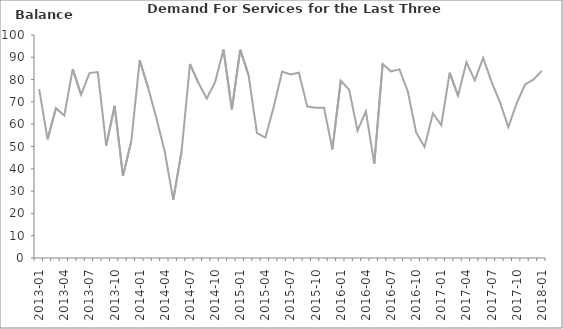
| Category | Balance |
|---|---|
| 2013-01 | 75.7 |
|  | 53.2 |
|  | 67.2 |
| 2013-04 | 63.9 |
|  | 84.7 |
|  | 73.2 |
| 2013-07 | 82.9 |
|  | 83.4 |
|  | 50.4 |
| 2013-10 | 68.2 |
|  | 36.8 |
|  | 52.5 |
| 2014-01 | 88.7 |
|  | 76.4 |
|  | 62.6 |
| 2014-04 | 47.5 |
|  | 26.1 |
|  | 47.9 |
| 2014-07 | 87 |
|  | 78.6 |
|  | 71.5 |
| 2014-10 | 78.9 |
|  | 93.5 |
|  | 66.6 |
| 2015-01 | 93.4 |
|  | 81.9 |
|  | 56 |
| 2015-04 | 54 |
|  | 67.8 |
|  | 83.6 |
| 2015-07 | 82.3 |
|  | 83.1 |
|  | 67.9 |
| 2015-10 | 67.4 |
|  | 67.4 |
|  | 48.7 |
| 2016-01 | 79.5 |
|  | 75.5 |
|  | 57.1 |
| 2016-04 | 65.8 |
|  | 42.2 |
|  | 87 |
| 2016-07 | 83.7 |
|  | 84.6 |
|  | 74.8 |
| 2016-10 | 56.3 |
|  | 49.8 |
|  | 64.9 |
| 2017-01 | 59.6 |
|  | 83.1 |
|  | 72.8 |
| 2017-04 | 87.8 |
|  | 79.7 |
|  | 89.7 |
| 2017-07 | 79 |
|  | 69.9 |
|  | 58.7 |
| 2017-10 | 69.4 |
|  | 77.8 |
|  | 80 |
| 2018-01 | 83.9 |